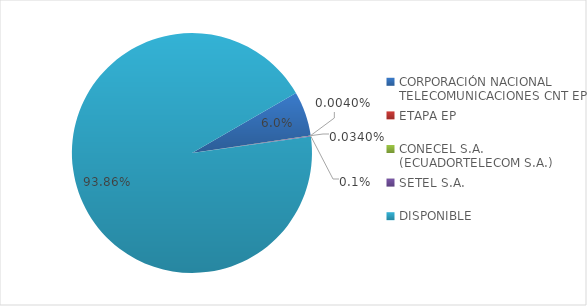
| Category | CÓDIGO DE ÁREA 3 |
|---|---|
| CORPORACIÓN NACIONAL TELECOMUNICACIONES CNT EP | 0.06 |
| ETAPA EP | 0 |
| CONECEL S.A. (ECUADORTELECOM S.A.) | 0 |
| SETEL S.A. | 0.001 |
| DISPONIBLE | 0.939 |